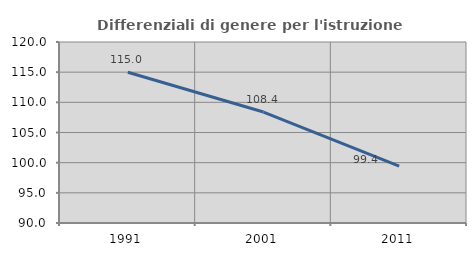
| Category | Differenziali di genere per l'istruzione superiore |
|---|---|
| 1991.0 | 114.985 |
| 2001.0 | 108.39 |
| 2011.0 | 99.436 |